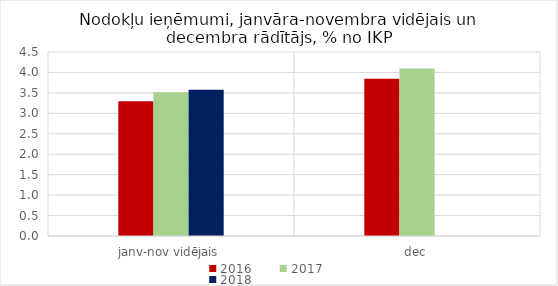
| Category | 2016 | 2017 | 2018 |
|---|---|---|---|
| janv-nov vidējais | 3.293 | 3.514 | 3.576 |
| dec | 3.846 | 4.096 | 0 |